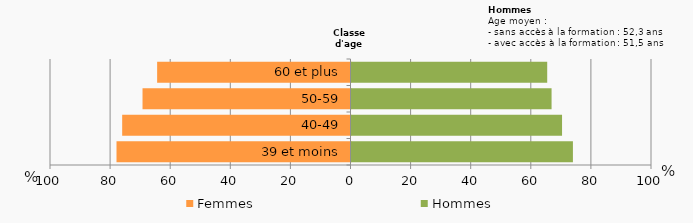
| Category | Femmes | Hommes |
|---|---|---|
| 39 et moins | -77.869 | 73.684 |
| 40-49 | -75.981 | 70.067 |
| 50-59 | -69.21 | 66.578 |
| 60 et plus | -64.348 | 65.128 |